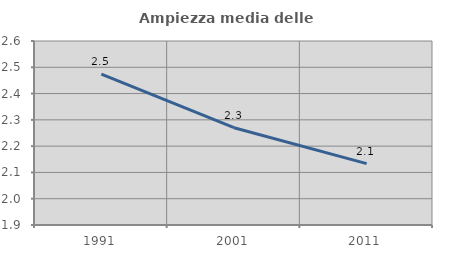
| Category | Ampiezza media delle famiglie |
|---|---|
| 1991.0 | 2.474 |
| 2001.0 | 2.27 |
| 2011.0 | 2.134 |